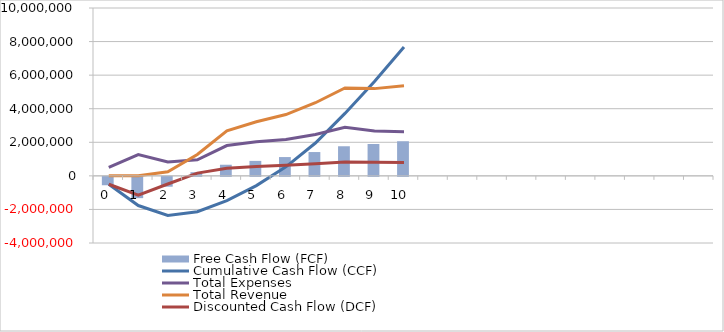
| Category | Free Cash Flow (FCF) |
|---|---|
| 0  | -500000 |
| 1  | -1268131.868 |
| 2  | -586868.132 |
| 3  | 218337.5 |
| 4  | 662839.825 |
| 5  | 891841.829 |
| 6  | 1119672.349 |
| 7  | 1418267.548 |
| 8  | 1763314.909 |
| 9  | 1898106.646 |
| 10  | 2061492.347 |
|   | 0 |
|   | 0 |
|   | 0 |
|   | 0 |
|   | 0 |
|   | 0 |
|   | 0 |
|   | 0 |
|   | 0 |
|   | 0 |